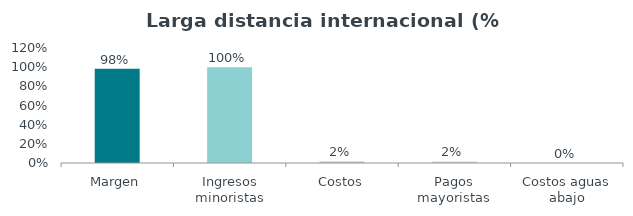
| Category | Series 0 |
|---|---|
| Margen | 0.983 |
| Ingresos minoristas | 1 |
| Costos | 0.017 |
| Pagos mayoristas | 0.016 |
| Costos aguas abajo | 0 |